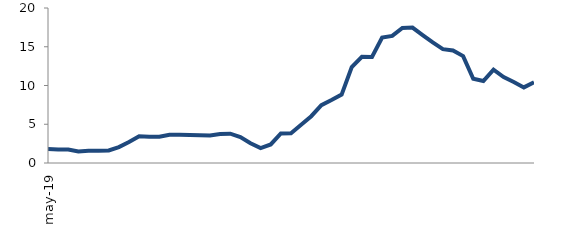
| Category | Series 0 |
|---|---|
| 2019-05-01 | 1.814 |
| 2019-06-01 | 1.756 |
| 2019-07-01 | 1.75 |
| 2019-08-01 | 1.495 |
| 2019-09-01 | 1.596 |
| 2019-10-01 | 1.597 |
| 2019-11-01 | 1.624 |
| 2019-12-01 | 2.057 |
| 2020-01-01 | 2.71 |
| 2020-02-01 | 3.453 |
| 2020-03-01 | 3.382 |
| 2020-04-01 | 3.383 |
| 2020-05-01 | 3.648 |
| 2020-06-01 | 3.638 |
| 2020-07-01 | 3.61 |
| 2020-08-01 | 3.571 |
| 2020-09-01 | 3.559 |
| 2020-10-01 | 3.75 |
| 2020-11-01 | 3.789 |
| 2020-12-01 | 3.346 |
| 2021-01-01 | 2.551 |
| 2021-02-01 | 1.916 |
| 2021-03-01 | 2.39 |
| 2021-04-01 | 3.807 |
| 2021-05-01 | 3.85 |
| 2021-06-01 | 4.942 |
| 2021-07-01 | 6.041 |
| 2021-08-01 | 7.459 |
| 2021-09-01 | 8.119 |
| 2021-10-01 | 8.829 |
| 2021-11-01 | 12.381 |
| 2021-12-01 | 13.709 |
| 2022-01-01 | 13.673 |
| 2022-02-01 | 16.179 |
| 2022-03-01 | 16.399 |
| 2022-04-01 | 17.419 |
| 2022-05-01 | 17.477 |
| 2022-06-01 | 16.514 |
| 2022-07-01 | 15.557 |
| 2022-08-01 | 14.696 |
| 2022-09-01 | 14.515 |
| 2022-10-01 | 13.796 |
| 2022-11-01 | 10.866 |
| 2022-12-01 | 10.58 |
| 2023-01-01 | 12.036 |
| 2023-02-01 | 11.079 |
| 2023-03-01 | 10.449 |
| 2023-04-01 | 9.756 |
| 2023-05-01 | 10.419 |